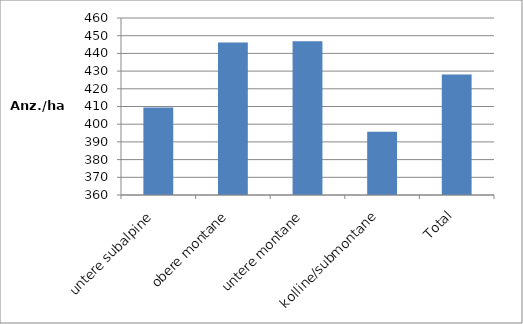
| Category | Series 0 |
|---|---|
| untere subalpine | 409.5 |
| obere montane | 446.1 |
| untere montane | 446.8 |
| kolline/submontane | 395.7 |
| Total | 428.1 |